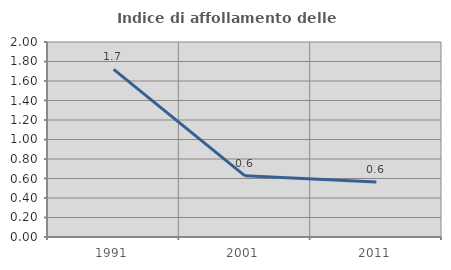
| Category | Indice di affollamento delle abitazioni  |
|---|---|
| 1991.0 | 1.72 |
| 2001.0 | 0.628 |
| 2011.0 | 0.565 |